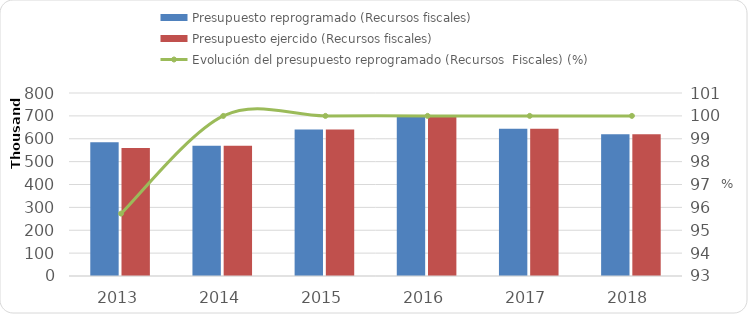
| Category | Presupuesto reprogramado (Recursos fiscales) | Presupuesto ejercido (Recursos fiscales)  |
|---|---|---|
| 2013 | 584645.8 | 559675.9 |
| 2014 | 569365.9 | 569354.2 |
| 2015 | 640885.41 | 640885.402 |
| 2016 | 704293.4 | 704293.4 |
| 2017 | 643942.891 | 643942.891 |
| 2018 | 619970.704 | 619970.704 |